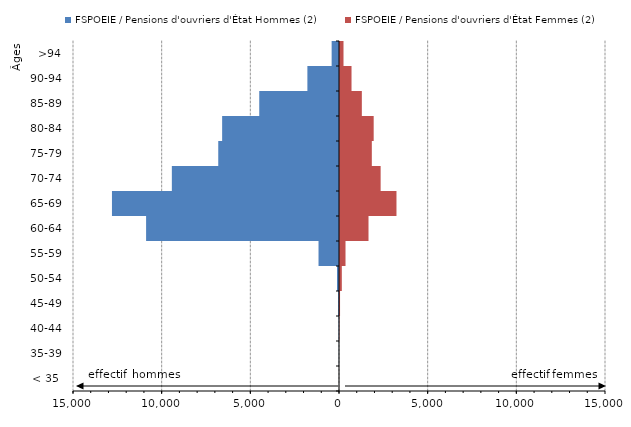
| Category | FSPOEIE / Pensions d'ouvriers d'État Hommes (2) | FSPOEIE / Pensions d'ouvriers d'État Femmes (2) |
|---|---|---|
| < 35  | 0 | 1 |
| 35-39 | -7 | 1 |
| 40-44 | -18 | 20 |
| 45-49 | -46 | 59 |
| 50-54 | -113 | 159 |
| 55-59 | -1155 | 367 |
| 60-64 | -10878 | 1664 |
| 65-69 | -12803 | 3241 |
| 70-74 | -9426 | 2348 |
| 75-79 | -6809 | 1851 |
| 80-84 | -6590 | 1956 |
| 85-89 | -4497 | 1288 |
| 90-94 | -1783 | 706 |
| >94 | -415 | 254 |